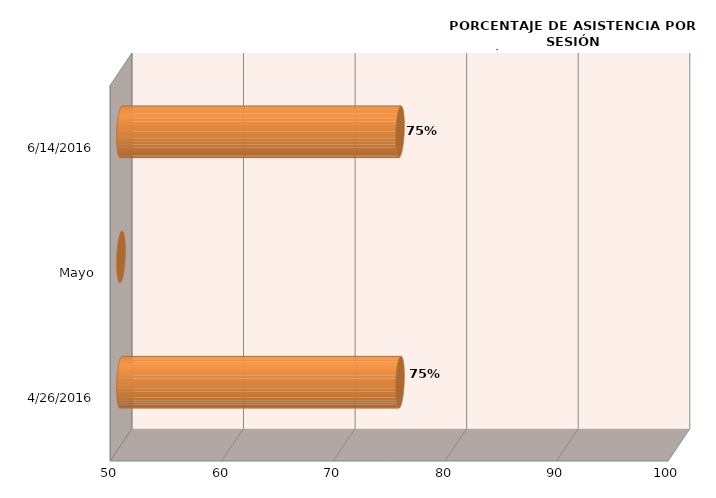
| Category | Series 0 |
|---|---|
| 26/04/2016 | 75 |
| Mayo | 0 |
| 14/06/2016 | 75 |